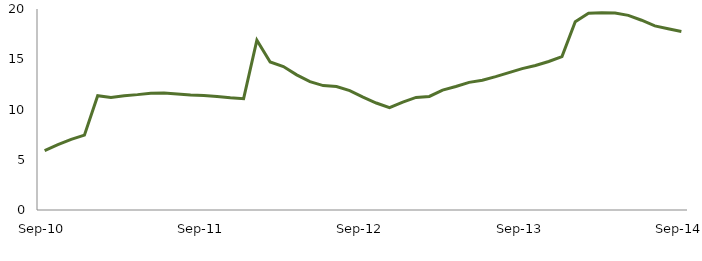
| Category | Series 0 |
|---|---|
| Sep-10 | 5.906 |
|  | 6.496 |
|  | 7.032 |
|  | 7.452 |
|  | 11.37 |
|  | 11.198 |
|  | 11.376 |
|  | 11.48 |
|  | 11.628 |
|  | 11.638 |
|  | 11.549 |
|  | 11.441 |
| Sep-11 | 11.392 |
|  | 11.289 |
|  | 11.163 |
|  | 11.08 |
|  | 16.903 |
|  | 14.732 |
|  | 14.273 |
|  | 13.449 |
|  | 12.778 |
|  | 12.379 |
|  | 12.281 |
|  | 11.878 |
| Sep-12 | 11.225 |
|  | 10.643 |
|  | 10.175 |
|  | 10.732 |
|  | 11.199 |
|  | 11.297 |
|  | 11.935 |
|  | 12.289 |
|  | 12.699 |
|  | 12.911 |
|  | 13.266 |
|  | 13.675 |
| Sep-13 | 14.064 |
|  | 14.382 |
|  | 14.778 |
|  | 15.268 |
|  | 18.737 |
|  | 19.583 |
|  | 19.624 |
|  | 19.606 |
|  | 19.369 |
|  | 18.883 |
|  | 18.323 |
|  | 18.035 |
| Sep-14 | 17.769 |